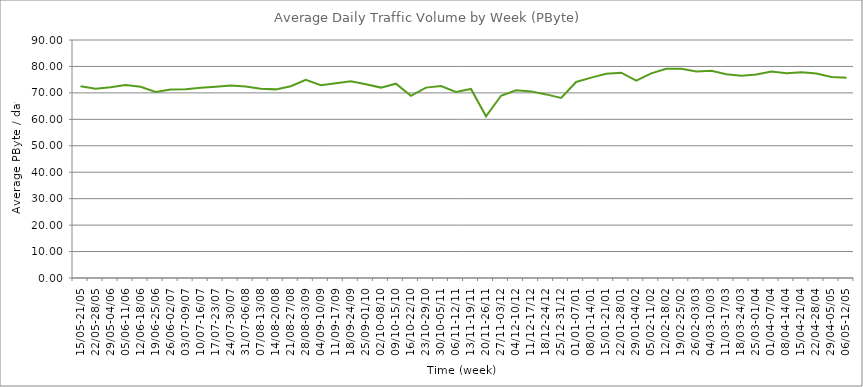
| Category | Average |
|---|---|
| 15/05-21/05 | 72.49 |
| 22/05-28/05 | 71.6 |
| 29/05-04/06 | 72.11 |
| 05/06-11/06 | 73 |
| 12/06-18/06 | 72.31 |
| 19/06-25/06 | 70.36 |
| 26/06-02/07 | 71.25 |
| 03/07-09/07 | 71.4 |
| 10/07-16/07 | 71.98 |
| 17/07-23/07 | 72.36 |
| 24/07-30/07 | 72.84 |
| 31/07-06/08 | 72.44 |
| 07/08-13/08 | 71.6 |
| 14/08-20/08 | 71.33 |
| 21/08-27/08 | 72.52 |
| 28/08-03/09 | 74.93 |
| 04/09-10/09 | 72.91 |
| 11/09-17/09 | 73.66 |
| 18/09-24/09 | 74.4 |
| 25/09-01/10 | 73.28 |
| 02/10-08/10 | 72 |
| 09/10-15/10 | 73.48 |
| 16/10-22/10 | 68.89 |
| 23/10-29/10 | 72 |
| 30/10-05/11 | 72.57 |
| 06/11-12/11 | 70.33 |
| 13/11-19/11 | 71.49 |
| 20/11-26/11 | 61.13 |
| 27/11-03/12 | 68.93 |
| 04/12-10/12 | 71 |
| 11/12-17/12 | 70.57 |
| 18/12-24/12 | 69.43 |
| 25/12-31/12 | 68.12 |
| 01/01-07/01 | 74.14 |
| 08/01-14/01 | 75.77 |
| 15/01-21/01 | 77.26 |
| 22/01-28/01 | 77.64 |
| 29/01-04/02 | 74.61 |
| 05/02-11/02 | 77.37 |
| 12/02-18/02 | 79.14 |
| 19/02-25/02 | 79.15 |
| 26/02-03/03 | 78.13 |
| 04/03-10/03 | 78.33 |
| 11/03-17/03 | 77.03 |
| 18/03-24/03 | 76.52 |
| 25/03-01/04 | 76.95 |
| 01/04-07/04 | 78.09 |
| 08/04-14/04 | 77.47 |
| 15/04-21/04 | 77.82 |
| 22/04-28/04 | 77.34 |
| 29/04-05/05 | 75.99 |
| 06/05-12/05 | 75.72 |